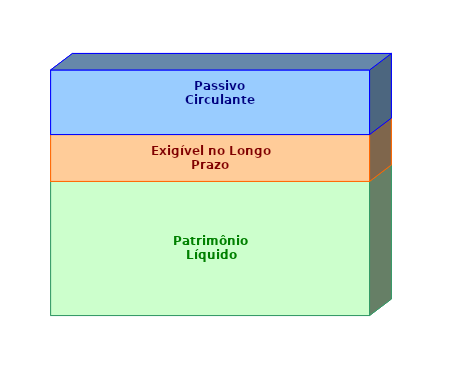
| Category | Patrimônio Líquido | Exigível no Longo Prazo | Passivo Circulante |
|---|---|---|---|
| 0 | 0.546 | 0.191 | 0.263 |